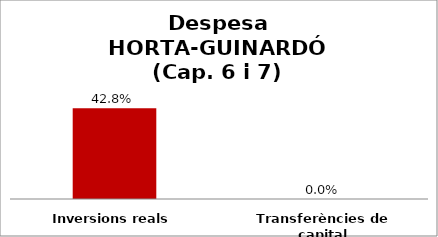
| Category | Series 0 |
|---|---|
| Inversions reals | 0.428 |
| Transferències de capital | 0 |